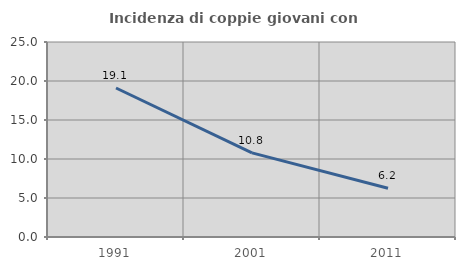
| Category | Incidenza di coppie giovani con figli |
|---|---|
| 1991.0 | 19.103 |
| 2001.0 | 10.791 |
| 2011.0 | 6.244 |